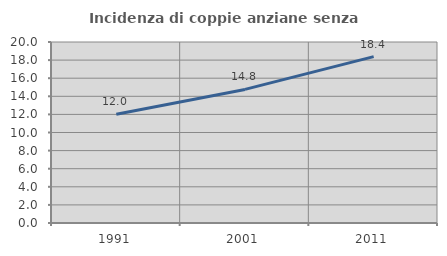
| Category | Incidenza di coppie anziane senza figli  |
|---|---|
| 1991.0 | 12.016 |
| 2001.0 | 14.761 |
| 2011.0 | 18.386 |